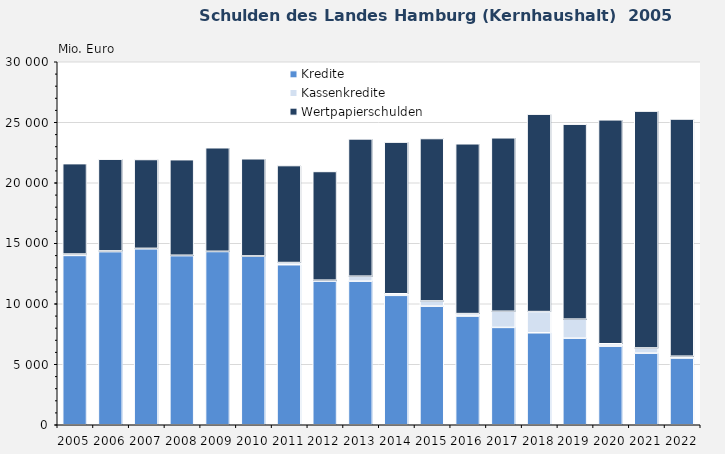
| Category | Kredite | Kassenkredite | Wertpapierschulden |
|---|---|---|---|
| 2005.0 | 13993 | 115 | 7472 |
| 2006.0 | 14309 | 58 | 7582 |
| 2007.0 | 14546 | 33 | 7343 |
| 2008.0 | 13976 | 33 | 7898 |
| 2009.0 | 14321 | 14 | 8558 |
| 2010.0 | 13949 | 2 | 8032 |
| 2011.0 | 13227 | 179 | 8015 |
| 2012.0 | 11873 | 75 | 8985 |
| 2013.0 | 11865 | 414 | 11347 |
| 2014.0 | 10695 | 131 | 12532 |
| 2015.0 | 9802 | 430 | 13423 |
| 2016.0 | 8987 | 199 | 14035 |
| 2017.0 | 8046 | 1335 | 14335 |
| 2018.0 | 7601 | 1751 | 16319 |
| 2019.0 | 7155 | 1574 | 16114 |
| 2020.0 | 6499 | 195 | 18507 |
| 2021.0 | 5916 | 430 | 19575 |
| 2022.0 | 5518 | 146 | 19604 |